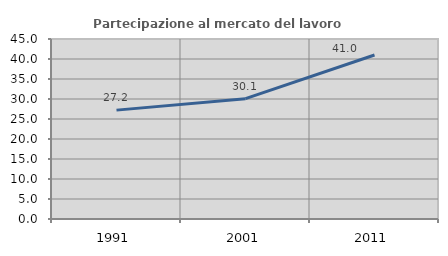
| Category | Partecipazione al mercato del lavoro  femminile |
|---|---|
| 1991.0 | 27.22 |
| 2001.0 | 30.09 |
| 2011.0 | 41 |